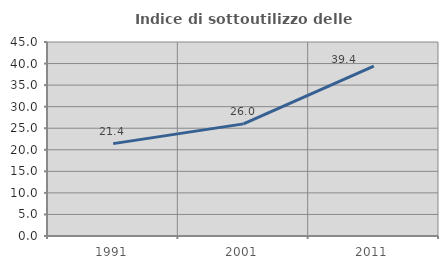
| Category | Indice di sottoutilizzo delle abitazioni  |
|---|---|
| 1991.0 | 21.429 |
| 2001.0 | 26.012 |
| 2011.0 | 39.403 |